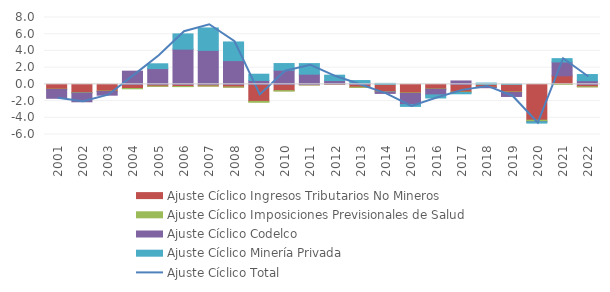
| Category | Ajuste Cíclico Ingresos Tributarios No Mineros | Ajuste Cíclico Imposiciones Previsionales de Salud | Ajuste Cíclico Codelco | Ajuste Cíclico Minería Privada |
|---|---|---|---|---|
| 2001.0 | -0.576 | -0.034 | -1.059 | 0 |
| 2002.0 | -0.975 | -0.054 | -1.055 | 0 |
| 2003.0 | -0.804 | -0.05 | -0.441 | 0 |
| 2004.0 | -0.497 | -0.033 | 1.579 | 0 |
| 2005.0 | -0.214 | -0.016 | 1.889 | 0.573 |
| 2006.0 | -0.253 | -0.017 | 4.213 | 1.826 |
| 2007.0 | -0.19 | -0.013 | 4.065 | 2.684 |
| 2008.0 | -0.311 | -0.019 | 2.845 | 2.229 |
| 2009.0 | -2.036 | -0.11 | 0.469 | 0.745 |
| 2010.0 | -0.748 | -0.06 | 1.695 | 0.795 |
| 2011.0 | -0.061 | -0.006 | 1.22 | 1.264 |
| 2012.0 | 0.068 | 0.003 | 0.385 | 0.642 |
| 2013.0 | -0.337 | -0.02 | 0.148 | 0.307 |
| 2014.0 | -0.854 | -0.049 | -0.181 | 0.117 |
| 2015.0 | -1.031 | -0.058 | -1.334 | -0.217 |
| 2016.0 | -0.558 | -0.031 | -0.674 | -0.365 |
| 2017.0 | -0.924 | -0.054 | 0.407 | -0.148 |
| 2018.0 | -0.339 | -0.025 | -0.036 | 0.152 |
| 2019.0 | -0.916 | -0.057 | -0.475 | 0.03 |
| 2020.0 | -4.288 | -0.193 | -0.008 | -0.147 |
| 2021.0 | 1.022 | -0.011 | 1.66 | 0.394 |
| 2022.0 | -0.284 | -0.01 | 0.439 | 0.737 |